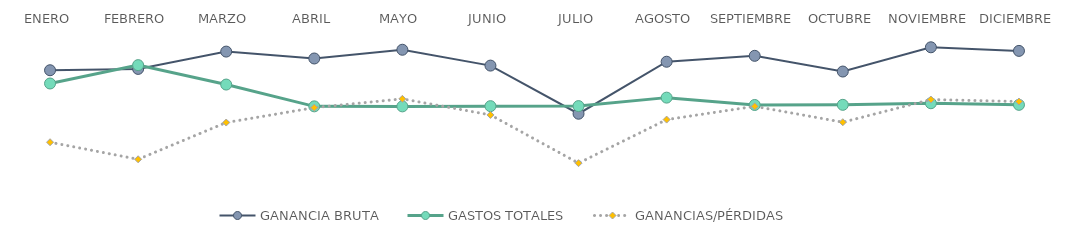
| Category | GANANCIA BRUTA | GASTOS TOTALES | GANANCIAS/PÉRDIDAS |
|---|---|---|---|
| ENERO | 72564 | 61281 | 11283 |
| FEBRERO | 73678 | 76903 | -3225 |
| MARZO | 88429 | 60375 | 28054 |
| ABRIL | 82563 | 41833 | 40730 |
| MAYO | 90001 | 41805 | 48196 |
| JUNIO | 76514 | 41994 | 34520 |
| JULIO | 35551 | 42059 | -6508 |
| AGOSTO | 79802 | 49250 | 30552 |
| SEPTIEMBRE | 84831 | 42993 | 41838 |
| OCTUBRE | 71450 | 43125 | 28325 |
| NOVIEMBRE | 92092 | 44473 | 47619 |
| DICIEMBRE | 89024 | 43110 | 45914 |